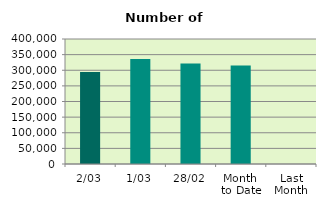
| Category | Series 0 |
|---|---|
| 2/03 | 294278 |
| 1/03 | 336356 |
| 28/02 | 321404 |
| Month 
to Date | 315317 |
| Last
Month | 0 |